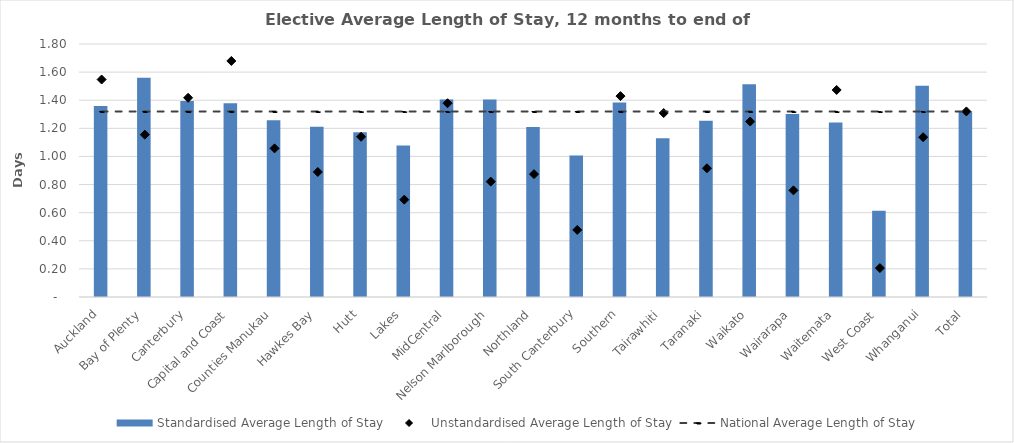
| Category | Standardised Average Length of Stay |
|---|---|
| Auckland | 1.359 |
| Bay of Plenty | 1.559 |
| Canterbury | 1.395 |
| Capital and Coast | 1.379 |
| Counties Manukau | 1.257 |
| Hawkes Bay | 1.211 |
| Hutt | 1.173 |
| Lakes | 1.078 |
| MidCentral | 1.405 |
| Nelson Marlborough | 1.405 |
| Northland | 1.209 |
| South Canterbury | 1.006 |
| Southern | 1.384 |
| Tairawhiti | 1.13 |
| Taranaki | 1.254 |
| Waikato | 1.514 |
| Wairarapa | 1.302 |
| Waitemata | 1.242 |
| West Coast | 0.614 |
| Whanganui | 1.502 |
| Total | 1.32 |